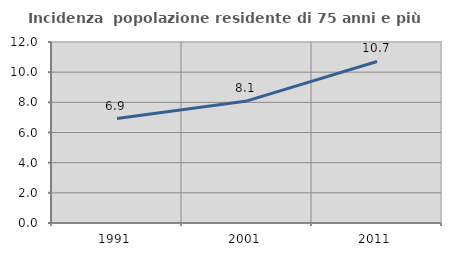
| Category | Incidenza  popolazione residente di 75 anni e più |
|---|---|
| 1991.0 | 6.926 |
| 2001.0 | 8.093 |
| 2011.0 | 10.711 |